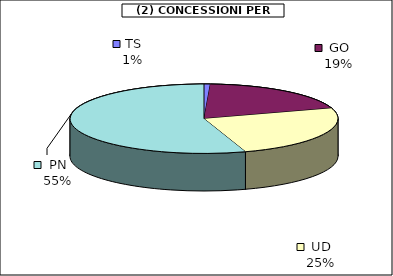
| Category | Series 0 |
|---|---|
| TS | 409 |
| GO | 10420 |
| UD | 13448 |
| PN | 29678.5 |